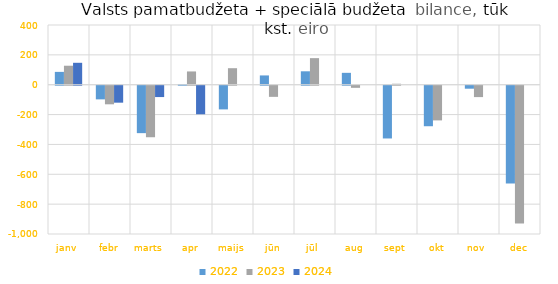
| Category | 2022 | 2023 | 2024 |
|---|---|---|---|
| janv | 85977.566 | 127204.091 | 146817.044 |
| febr | -91449.582 | -124563.375 | -113614.856 |
| marts | -317726.304 | -345186.23 | -76031.036 |
| apr | 4462.198 | 88892.873 | -191360.553 |
| maijs | -158594.854 | 110598.178 | 0 |
| jūn | 62199.471 | -74676.403 | 0 |
| jūl | 89874.872 | 178052.175 | 0 |
| aug | 79584.039 | -14215.982 | 0 |
| sept | -353345.335 | 6441.615 | 0 |
| okt | -271420.986 | -232336.483 | 0 |
| nov | -20014.95 | -76225.649 | 0 |
| dec | -655267.986 | -923572.73 | 0 |